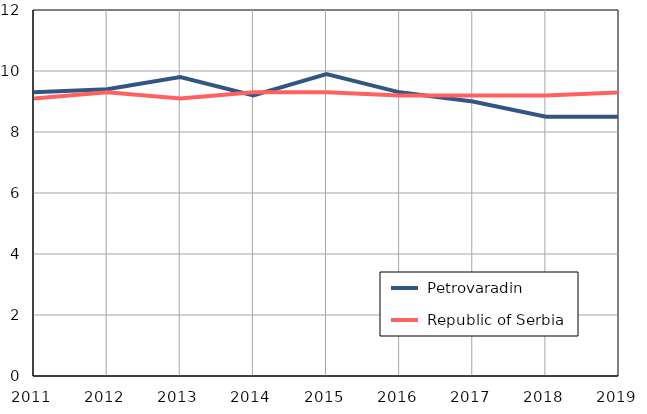
| Category |  Petrovaradin |  Republic of Serbia |
|---|---|---|
| 2011.0 | 9.3 | 9.1 |
| 2012.0 | 9.4 | 9.3 |
| 2013.0 | 9.8 | 9.1 |
| 2014.0 | 9.2 | 9.3 |
| 2015.0 | 9.9 | 9.3 |
| 2016.0 | 9.3 | 9.2 |
| 2017.0 | 9 | 9.2 |
| 2018.0 | 8.5 | 9.2 |
| 2019.0 | 8.5 | 9.3 |